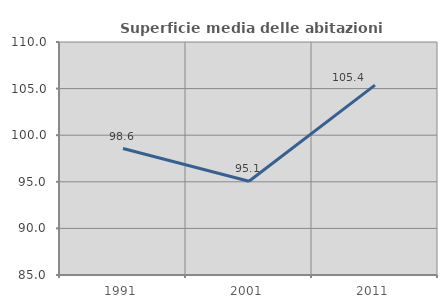
| Category | Superficie media delle abitazioni occupate |
|---|---|
| 1991.0 | 98.568 |
| 2001.0 | 95.058 |
| 2011.0 | 105.377 |